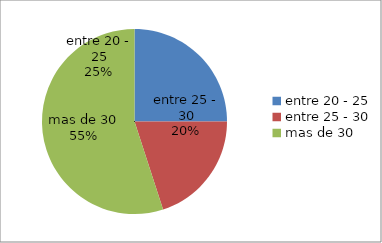
| Category | Series 0 |
|---|---|
| entre 20 - 25 | 100 |
| entre 25 - 30 | 80 |
| mas de 30 | 220 |